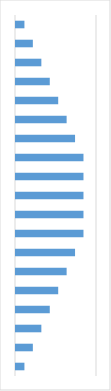
| Category | Series 0 |
|---|---|
| 2.0 | 1.04 |
| 3.0 | 2.08 |
| 4.0 | 3.13 |
| 5.0 | 4.17 |
| 6.0 | 5.21 |
| 7.0 | 6.25 |
| 8.0 | 7.29 |
| 9.0 | 8.33 |
| 10.0 | 8.33 |
| 11.0 | 8.33 |
| 12.0 | 8.33 |
| 13.0 | 8.33 |
| 14.0 | 7.29 |
| 15.0 | 6.25 |
| 16.0 | 5.21 |
| 17.0 | 4.17 |
| 18.0 | 3.13 |
| 19.0 | 2.08 |
| 20.0 | 1.04 |